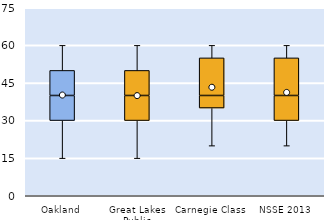
| Category | 25th | 50th | 75th |
|---|---|---|---|
| Oakland | 30 | 10 | 10 |
| Great Lakes Public | 30 | 10 | 10 |
| Carnegie Class | 35 | 5 | 15 |
| NSSE 2013 | 30 | 10 | 15 |